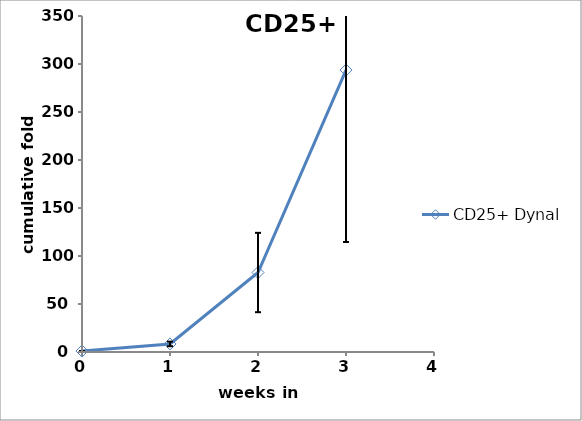
| Category | CD25+ |
|---|---|
| 0.0 | 1 |
| 1.0 | 8.404 |
| 2.0 | 82.783 |
| 3.0 | 293.681 |